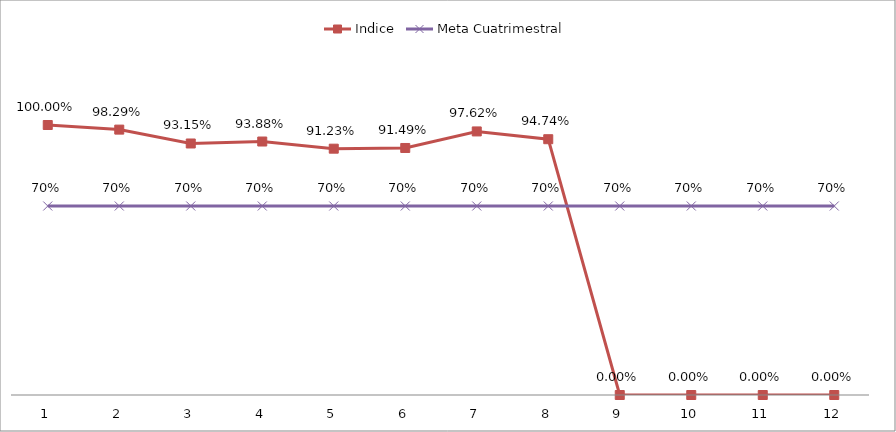
| Category | Indice | Meta Cuatrimestral |
|---|---|---|
| 0 | 1 | 0.7 |
| 1 | 0.983 | 0.7 |
| 2 | 0.932 | 0.7 |
| 3 | 0.939 | 0.7 |
| 4 | 0.912 | 0.7 |
| 5 | 0.915 | 0.7 |
| 6 | 0.976 | 0.7 |
| 7 | 0.947 | 0.7 |
| 8 | 0 | 0.7 |
| 9 | 0 | 0.7 |
| 10 | 0 | 0.7 |
| 11 | 0 | 0.7 |